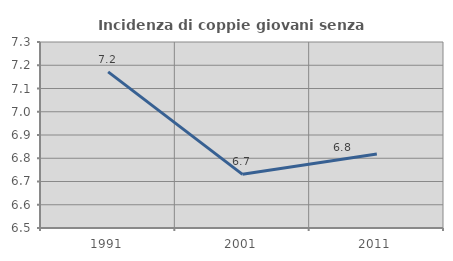
| Category | Incidenza di coppie giovani senza figli |
|---|---|
| 1991.0 | 7.171 |
| 2001.0 | 6.731 |
| 2011.0 | 6.818 |